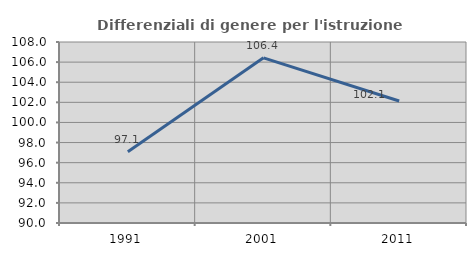
| Category | Differenziali di genere per l'istruzione superiore |
|---|---|
| 1991.0 | 97.08 |
| 2001.0 | 106.428 |
| 2011.0 | 102.132 |